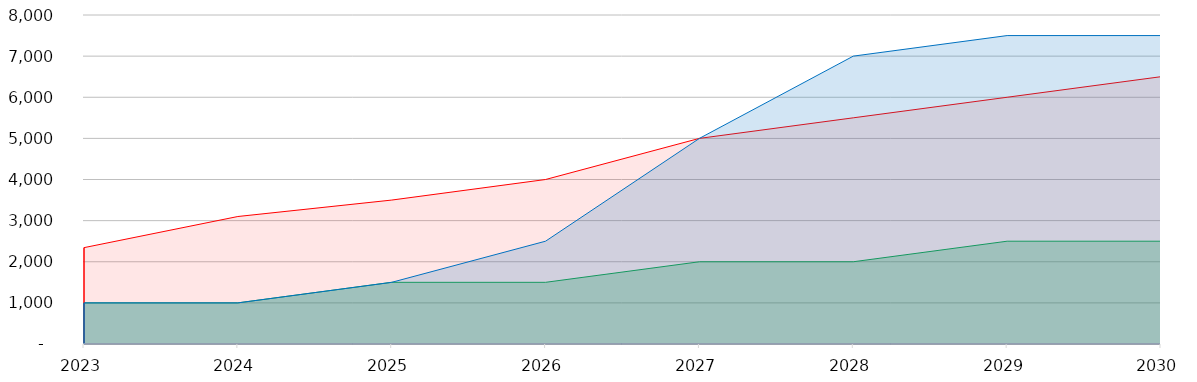
| Category | Существующие объемы производства  | Потребление в РФ | Производство с учетом проекта |
|---|---|---|---|
| 2023.0 | 1000 | 2343 | 1000 |
| 2024.0 | 1000 | 3100 | 1000 |
| 2025.0 | 1500 | 3500 | 1500 |
| 2026.0 | 1500 | 4000 | 2500 |
| 2027.0 | 2000 | 5000 | 5000 |
| 2028.0 | 2000 | 5500 | 7000 |
| 2029.0 | 2500 | 6000 | 7500 |
| 2030.0 | 2500 | 6500 | 7500 |